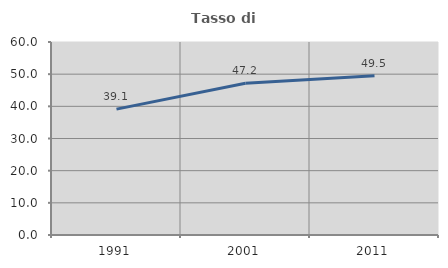
| Category | Tasso di occupazione   |
|---|---|
| 1991.0 | 39.135 |
| 2001.0 | 47.204 |
| 2011.0 | 49.496 |